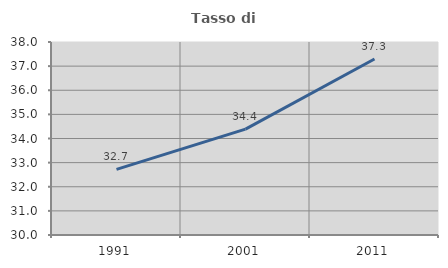
| Category | Tasso di occupazione   |
|---|---|
| 1991.0 | 32.723 |
| 2001.0 | 34.389 |
| 2011.0 | 37.294 |